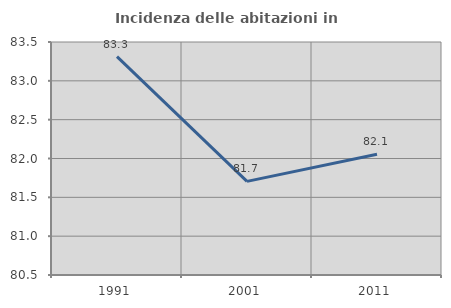
| Category | Incidenza delle abitazioni in proprietà  |
|---|---|
| 1991.0 | 83.312 |
| 2001.0 | 81.706 |
| 2011.0 | 82.055 |